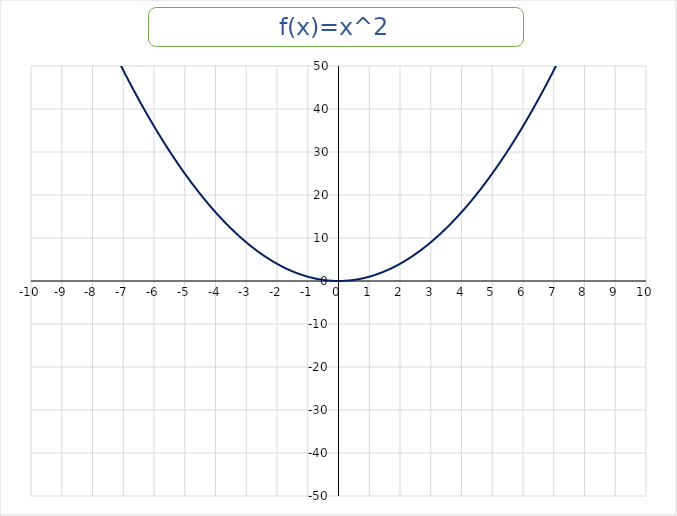
| Category | f(x)=(x+a)^2+b |
|---|---|
| -10.0 | 100 |
| -9.9 | 98.01 |
| -9.8 | 96.04 |
| -9.7 | 94.09 |
| -9.6 | 92.16 |
| -9.5 | 90.25 |
| -9.4 | 88.36 |
| -9.3 | 86.49 |
| -9.2 | 84.64 |
| -9.1 | 82.81 |
| -9.0 | 81 |
| -8.9 | 79.21 |
| -8.8 | 77.44 |
| -8.7 | 75.69 |
| -8.6 | 73.96 |
| -8.50000000000001 | 72.25 |
| -8.40000000000001 | 70.56 |
| -8.30000000000001 | 68.89 |
| -8.20000000000001 | 67.24 |
| -8.10000000000001 | 65.61 |
| -8.00000000000001 | 64 |
| -7.90000000000001 | 62.41 |
| -7.80000000000001 | 60.84 |
| -7.70000000000001 | 59.29 |
| -7.60000000000001 | 57.76 |
| -7.50000000000001 | 56.25 |
| -7.40000000000001 | 54.76 |
| -7.30000000000001 | 53.29 |
| -7.20000000000001 | 51.84 |
| -7.10000000000001 | 50.41 |
| -7.00000000000001 | 49 |
| -6.90000000000001 | 47.61 |
| -6.80000000000001 | 46.24 |
| -6.70000000000001 | 44.89 |
| -6.60000000000001 | 43.56 |
| -6.50000000000001 | 42.25 |
| -6.40000000000001 | 40.96 |
| -6.30000000000001 | 39.69 |
| -6.20000000000001 | 38.44 |
| -6.10000000000001 | 37.21 |
| -6.00000000000001 | 36 |
| -5.90000000000001 | 34.81 |
| -5.80000000000001 | 33.64 |
| -5.70000000000002 | 32.49 |
| -5.60000000000002 | 31.36 |
| -5.50000000000002 | 30.25 |
| -5.40000000000002 | 29.16 |
| -5.30000000000002 | 28.09 |
| -5.20000000000002 | 27.04 |
| -5.10000000000002 | 26.01 |
| -5.00000000000002 | 25 |
| -4.90000000000002 | 24.01 |
| -4.80000000000002 | 23.04 |
| -4.70000000000002 | 22.09 |
| -4.60000000000002 | 21.16 |
| -4.50000000000002 | 20.25 |
| -4.40000000000002 | 19.36 |
| -4.30000000000002 | 18.49 |
| -4.20000000000002 | 17.64 |
| -4.10000000000002 | 16.81 |
| -4.00000000000002 | 16 |
| -3.90000000000002 | 15.21 |
| -3.80000000000002 | 14.44 |
| -3.70000000000002 | 13.69 |
| -3.60000000000002 | 12.96 |
| -3.50000000000002 | 12.25 |
| -3.40000000000002 | 11.56 |
| -3.30000000000002 | 10.89 |
| -3.20000000000002 | 10.24 |
| -3.10000000000002 | 9.61 |
| -3.00000000000002 | 9 |
| -2.90000000000003 | 8.41 |
| -2.80000000000003 | 7.84 |
| -2.70000000000003 | 7.29 |
| -2.60000000000003 | 6.76 |
| -2.50000000000003 | 6.25 |
| -2.40000000000003 | 5.76 |
| -2.30000000000003 | 5.29 |
| -2.20000000000003 | 4.84 |
| -2.10000000000003 | 4.41 |
| -2.00000000000003 | 4 |
| -1.90000000000003 | 3.61 |
| -1.80000000000003 | 3.24 |
| -1.70000000000003 | 2.89 |
| -1.60000000000003 | 2.56 |
| -1.50000000000003 | 2.25 |
| -1.40000000000003 | 1.96 |
| -1.30000000000003 | 1.69 |
| -1.20000000000003 | 1.44 |
| -1.10000000000003 | 1.21 |
| -1.00000000000003 | 1 |
| -0.900000000000031 | 0.81 |
| -0.800000000000029 | 0.64 |
| -0.700000000000029 | 0.49 |
| -0.60000000000003 | 0.36 |
| -0.50000000000003 | 0.25 |
| -0.400000000000031 | 0.16 |
| -0.300000000000029 | 0.09 |
| -0.200000000000029 | 0.04 |
| -0.100000000000041 | 0.01 |
| 0.0 | 0 |
| 0.0999999999999996 | 0.01 |
| 0.199999999999999 | 0.04 |
| 0.300000000000001 | 0.09 |
| 0.4 | 0.16 |
| 0.5 | 0.25 |
| 0.6 | 0.36 |
| 0.699999999999999 | 0.49 |
| 0.800000000000001 | 0.64 |
| 0.9 | 0.81 |
| 1.0 | 1 |
| 1.1 | 1.21 |
| 1.2 | 1.44 |
| 1.3 | 1.69 |
| 1.4 | 1.96 |
| 1.5 | 2.25 |
| 1.6 | 2.56 |
| 1.7 | 2.89 |
| 1.8 | 3.24 |
| 1.9 | 3.61 |
| 2.0 | 4 |
| 2.1 | 4.41 |
| 2.2 | 4.84 |
| 2.3 | 5.29 |
| 2.4 | 5.76 |
| 2.5 | 6.25 |
| 2.6 | 6.76 |
| 2.7 | 7.29 |
| 2.8 | 7.84 |
| 2.9 | 8.41 |
| 3.0 | 9 |
| 3.1 | 9.61 |
| 3.2 | 10.24 |
| 3.3 | 10.89 |
| 3.4 | 11.56 |
| 3.5 | 12.25 |
| 3.6 | 12.96 |
| 3.7 | 13.69 |
| 3.8 | 14.44 |
| 3.9 | 15.21 |
| 4.0 | 16 |
| 4.0999999999999 | 16.81 |
| 4.1999999999999 | 17.64 |
| 4.2999999999999 | 18.49 |
| 4.3999999999999 | 19.36 |
| 4.4999999999999 | 20.25 |
| 4.5999999999999 | 21.16 |
| 4.6999999999999 | 22.09 |
| 4.7999999999999 | 23.04 |
| 4.8999999999999 | 24.01 |
| 4.9999999999999 | 25 |
| 5.0999999999999 | 26.01 |
| 5.1999999999999 | 27.04 |
| 5.2999999999999 | 28.09 |
| 5.3999999999999 | 29.16 |
| 5.4999999999999 | 30.25 |
| 5.5999999999999 | 31.36 |
| 5.6999999999999 | 32.49 |
| 5.7999999999999 | 33.64 |
| 5.8999999999999 | 34.81 |
| 5.9999999999999 | 36 |
| 6.0999999999999 | 37.21 |
| 6.1999999999999 | 38.44 |
| 6.2999999999999 | 39.69 |
| 6.3999999999999 | 40.96 |
| 6.4999999999999 | 42.25 |
| 6.5999999999999 | 43.56 |
| 6.6999999999999 | 44.89 |
| 6.7999999999999 | 46.24 |
| 6.8999999999999 | 47.61 |
| 6.9999999999999 | 49 |
| 7.0999999999999 | 50.41 |
| 7.1999999999999 | 51.84 |
| 7.2999999999999 | 53.29 |
| 7.3999999999999 | 54.76 |
| 7.4999999999999 | 56.25 |
| 7.5999999999999 | 57.76 |
| 7.6999999999999 | 59.29 |
| 7.7999999999999 | 60.84 |
| 7.8999999999999 | 62.41 |
| 7.9999999999999 | 64 |
| 8.0999999999999 | 65.61 |
| 8.1999999999999 | 67.24 |
| 8.2999999999999 | 68.89 |
| 8.3999999999999 | 70.56 |
| 8.4999999999999 | 72.25 |
| 8.5999999999999 | 73.96 |
| 8.6999999999999 | 75.69 |
| 8.7999999999999 | 77.44 |
| 8.8999999999999 | 79.21 |
| 8.9999999999999 | 81 |
| 9.0999999999999 | 82.81 |
| 9.1999999999999 | 84.64 |
| 9.2999999999999 | 86.49 |
| 9.3999999999999 | 88.36 |
| 9.4999999999999 | 90.25 |
| 9.5999999999999 | 92.16 |
| 9.6999999999999 | 94.09 |
| 9.7999999999999 | 96.04 |
| 9.8999999999999 | 98.01 |
| 9.9999999999999 | 100 |